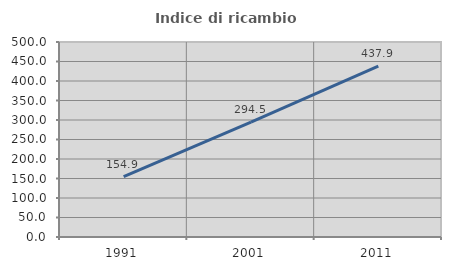
| Category | Indice di ricambio occupazionale  |
|---|---|
| 1991.0 | 154.878 |
| 2001.0 | 294.521 |
| 2011.0 | 437.879 |